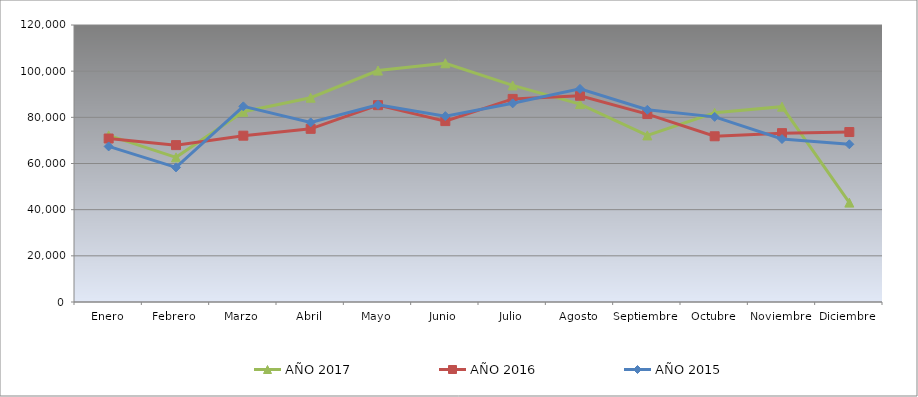
| Category | AÑO 2017 | AÑO 2016 | AÑO 2015 |
|---|---|---|---|
| Enero | 72187.368 | 70822.923 | 67394.487 |
| Febrero | 62658.612 | 67961.568 | 58304.068 |
| Marzo | 82404.872 | 72054.651 | 84761.527 |
| Abril | 88496.301 | 75015.481 | 77799.038 |
| Mayo | 100250.513 | 85273.058 | 85412.565 |
| Junio | 103411.407 | 78368.357 | 80529.781 |
| Julio | 93817.917 | 87970.572 | 86063.603 |
| Agosto | 85746.556 | 89351.513 | 92314.774 |
| Septiembre | 72166.956 | 81416.958 | 83260.523 |
| Octubre | 81967.479 | 71797.188 | 80204.262 |
| Noviembre | 84626.829 | 73154.722 | 70601.451 |
| Diciembre | 43051.151 | 73628.689 | 68322.819 |